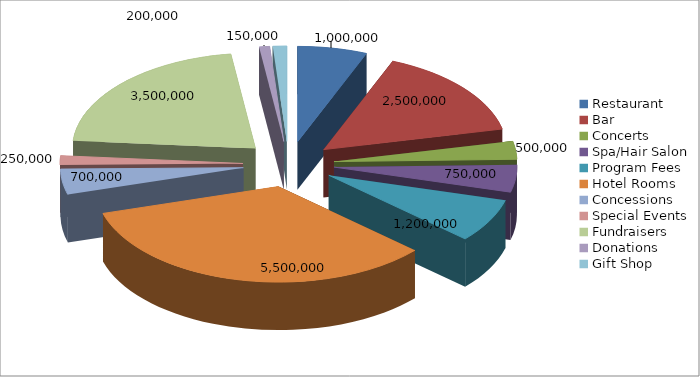
| Category | Series 0 |
|---|---|
| Restaurant | 1000000 |
| Bar | 2500000 |
| Concerts | 500000 |
| Spa/Hair Salon | 750000 |
| Program Fees | 1200000 |
| Hotel Rooms | 5500000 |
| Concessions | 700000 |
| Special Events | 250000 |
| Fundraisers | 3500000 |
| Donations | 150000 |
| Gift Shop | 200000 |